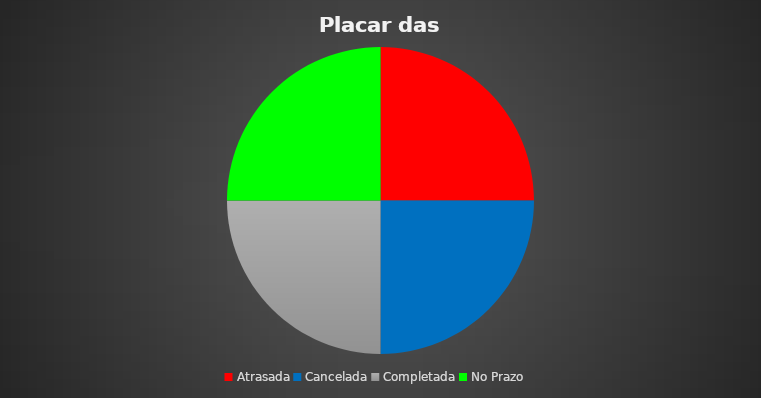
| Category | Series 0 |
|---|---|
| Atrasada | 1 |
| Cancelada | 1 |
| Completada | 1 |
| No Prazo | 1 |